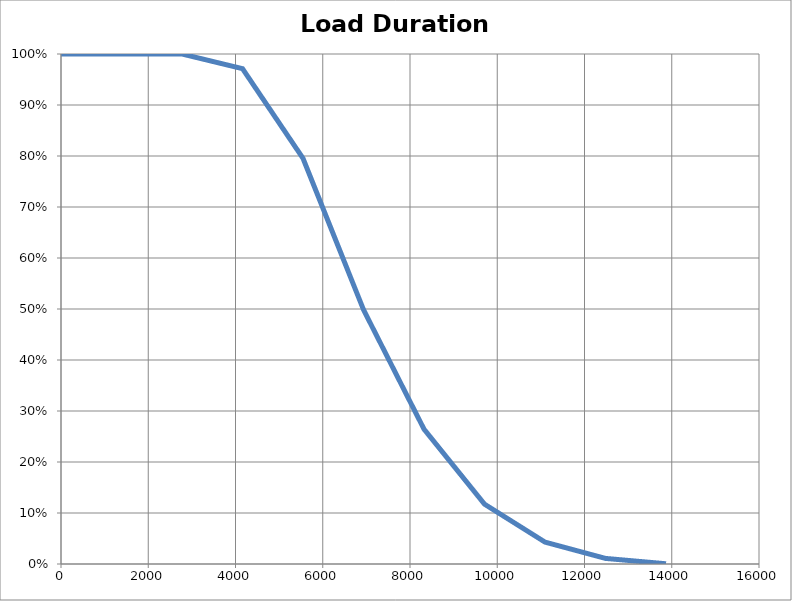
| Category | LDC |
|---|---|
| 0.0 | 1 |
| 13.86830189918268 | 1 |
| 27.73660379836537 | 1 |
| 41.60490569754806 | 1 |
| 55.47320759673074 | 1 |
| 69.3415094959134 | 1 |
| 83.20981139509611 | 1 |
| 97.0781132942788 | 1 |
| 110.9464151934615 | 1 |
| 124.8147170926442 | 1 |
| 138.6830189918269 | 1 |
| 152.5513208910095 | 1 |
| 166.4196227901922 | 1 |
| 180.287924689375 | 1 |
| 194.1562265885576 | 1 |
| 208.0245284877403 | 1 |
| 221.892830386923 | 1 |
| 235.7611322861057 | 1 |
| 249.6294341852883 | 1 |
| 263.497736084471 | 1 |
| 277.3660379836537 | 1 |
| 291.2343398828364 | 1 |
| 305.102641782019 | 1 |
| 318.9709436812017 | 1 |
| 332.8392455803844 | 1 |
| 346.7075474795672 | 1 |
| 360.5758493787498 | 1 |
| 374.4441512779325 | 1 |
| 388.3124531771152 | 1 |
| 402.1807550762979 | 1 |
| 416.0490569754805 | 1 |
| 429.9173588746633 | 1 |
| 443.785660773846 | 1 |
| 457.6539626730286 | 1 |
| 471.5222645722113 | 1 |
| 485.390566471394 | 1 |
| 499.2588683705766 | 1 |
| 513.1271702697592 | 1 |
| 526.995472168942 | 1 |
| 540.8637740681247 | 1 |
| 554.7320759673074 | 1 |
| 568.60037786649 | 1 |
| 582.4686797656728 | 1 |
| 596.3369816648554 | 1 |
| 610.205283564038 | 1 |
| 624.0735854632208 | 1 |
| 637.9418873624035 | 1 |
| 651.8101892615861 | 1 |
| 665.6784911607688 | 1 |
| 679.5467930599516 | 1 |
| 693.4150949591343 | 1 |
| 707.283396858317 | 1 |
| 721.1516987574996 | 1 |
| 735.0200006566823 | 1 |
| 748.888302555865 | 1 |
| 762.7566044550476 | 1 |
| 776.6249063542303 | 1 |
| 790.4932082534131 | 1 |
| 804.3615101525958 | 1 |
| 818.2298120517783 | 1 |
| 832.098113950961 | 1 |
| 845.9664158501438 | 1 |
| 859.8347177493265 | 1 |
| 873.703019648509 | 1 |
| 887.5713215476918 | 1 |
| 901.4396234468745 | 1 |
| 915.3079253460572 | 1 |
| 929.1762272452399 | 1 |
| 943.0445291444227 | 1 |
| 956.9128310436053 | 1 |
| 970.781132942788 | 1 |
| 984.6494348419706 | 1 |
| 998.5177367411532 | 1 |
| 1012.386038640336 | 1 |
| 1026.254340539519 | 1 |
| 1040.122642438701 | 1 |
| 1053.990944337884 | 1 |
| 1067.859246237067 | 1 |
| 1081.727548136249 | 1 |
| 1095.595850035432 | 1 |
| 1109.464151934615 | 1 |
| 1123.332453833797 | 1 |
| 1137.20075573298 | 1 |
| 1151.069057632163 | 1 |
| 1164.937359531346 | 1 |
| 1178.805661430528 | 1 |
| 1192.673963329711 | 1 |
| 1206.542265228893 | 1 |
| 1220.410567128076 | 1 |
| 1234.278869027259 | 1 |
| 1248.147170926442 | 1 |
| 1262.015472825624 | 1 |
| 1275.883774724807 | 1 |
| 1289.75207662399 | 1 |
| 1303.620378523172 | 1 |
| 1317.488680422355 | 1 |
| 1331.356982321538 | 1 |
| 1345.22528422072 | 1 |
| 1359.093586119903 | 1 |
| 1372.961888019086 | 1 |
| 1386.830189918269 | 1 |
| 1400.698491817451 | 1 |
| 1414.566793716634 | 1 |
| 1428.435095615816 | 1 |
| 1442.303397514999 | 1 |
| 1456.171699414182 | 1 |
| 1470.040001313365 | 1 |
| 1483.908303212547 | 1 |
| 1497.77660511173 | 1 |
| 1511.644907010913 | 1 |
| 1525.513208910095 | 1 |
| 1539.381510809278 | 1 |
| 1553.249812708461 | 1 |
| 1567.118114607644 | 1 |
| 1580.986416506826 | 1 |
| 1594.854718406009 | 1 |
| 1608.723020305192 | 1 |
| 1622.591322204374 | 1 |
| 1636.459624103557 | 1 |
| 1650.327926002739 | 1 |
| 1664.196227901922 | 1 |
| 1678.064529801105 | 1 |
| 1691.932831700288 | 1 |
| 1705.80113359947 | 1 |
| 1719.669435498653 | 1 |
| 1733.537737397836 | 1 |
| 1747.406039297018 | 1 |
| 1761.274341196201 | 1 |
| 1775.142643095384 | 1 |
| 1789.010944994566 | 1 |
| 1802.879246893749 | 1 |
| 1816.747548792932 | 1 |
| 1830.615850692114 | 1 |
| 1844.484152591297 | 1 |
| 1858.35245449048 | 1 |
| 1872.220756389662 | 1 |
| 1886.089058288845 | 1 |
| 1899.957360188028 | 1 |
| 1913.825662087211 | 1 |
| 1927.693963986393 | 1 |
| 1941.562265885576 | 1 |
| 1955.430567784758 | 1 |
| 1969.298869683941 | 1 |
| 1983.167171583124 | 1 |
| 1997.035473482307 | 1 |
| 2010.90377538149 | 1 |
| 2024.772077280672 | 1 |
| 2038.640379179855 | 1 |
| 2052.508681079037 | 1 |
| 2066.37698297822 | 1 |
| 2080.245284877403 | 1 |
| 2094.113586776585 | 1 |
| 2107.981888675768 | 1 |
| 2121.85019057495 | 1 |
| 2135.718492474134 | 1 |
| 2149.586794373316 | 1 |
| 2163.455096272498 | 1 |
| 2177.323398171682 | 1 |
| 2191.191700070864 | 1 |
| 2205.060001970047 | 1 |
| 2218.92830386923 | 1 |
| 2232.796605768413 | 1 |
| 2246.664907667595 | 1 |
| 2260.533209566778 | 1 |
| 2274.401511465961 | 1 |
| 2288.269813365143 | 1 |
| 2302.138115264326 | 1 |
| 2316.006417163509 | 1 |
| 2329.874719062691 | 1 |
| 2343.743020961874 | 1 |
| 2357.611322861056 | 1 |
| 2371.479624760239 | 1 |
| 2385.347926659422 | 1 |
| 2399.216228558604 | 1 |
| 2413.084530457787 | 1 |
| 2426.95283235697 | 1 |
| 2440.821134256152 | 1 |
| 2454.689436155335 | 1 |
| 2468.557738054518 | 1 |
| 2482.426039953701 | 1 |
| 2496.294341852883 | 1 |
| 2510.162643752066 | 1 |
| 2524.030945651249 | 1 |
| 2537.899247550431 | 1 |
| 2551.767549449614 | 1 |
| 2565.635851348797 | 1 |
| 2579.50415324798 | 1 |
| 2593.372455147162 | 1 |
| 2607.240757046345 | 1 |
| 2621.109058945528 | 1 |
| 2634.97736084471 | 1 |
| 2648.845662743893 | 1 |
| 2662.713964643076 | 1 |
| 2676.582266542258 | 1 |
| 2690.450568441441 | 1 |
| 2704.318870340624 | 1 |
| 2718.187172239806 | 1 |
| 2732.05547413899 | 1 |
| 2745.923776038171 | 1 |
| 2759.792077937354 | 1 |
| 2773.660379836537 | 1 |
| 2787.52868173572 | 1 |
| 2801.396983634902 | 0.999 |
| 2815.265285534085 | 0.999 |
| 2829.133587433268 | 0.999 |
| 2843.00188933245 | 0.999 |
| 2856.870191231633 | 0.998 |
| 2870.738493130816 | 0.998 |
| 2884.606795029998 | 0.998 |
| 2898.475096929181 | 0.997 |
| 2912.343398828363 | 0.997 |
| 2926.211700727546 | 0.997 |
| 2940.080002626729 | 0.997 |
| 2953.948304525912 | 0.996 |
| 2967.816606425095 | 0.996 |
| 2981.684908324277 | 0.996 |
| 2995.55321022346 | 0.995 |
| 3009.421512122643 | 0.995 |
| 3023.289814021825 | 0.995 |
| 3037.158115921008 | 0.995 |
| 3051.026417820191 | 0.994 |
| 3064.894719719373 | 0.994 |
| 3078.763021618556 | 0.994 |
| 3092.631323517738 | 0.993 |
| 3106.499625416921 | 0.993 |
| 3120.367927316104 | 0.993 |
| 3134.236229215287 | 0.993 |
| 3148.104531114469 | 0.992 |
| 3161.972833013652 | 0.992 |
| 3175.841134912835 | 0.992 |
| 3189.709436812017 | 0.991 |
| 3203.5777387112 | 0.991 |
| 3217.446040610383 | 0.991 |
| 3231.314342509565 | 0.991 |
| 3245.182644408748 | 0.99 |
| 3259.050946307931 | 0.99 |
| 3272.919248207113 | 0.99 |
| 3286.787550106296 | 0.989 |
| 3300.655852005478 | 0.989 |
| 3314.524153904661 | 0.989 |
| 3328.392455803844 | 0.988 |
| 3342.260757703027 | 0.988 |
| 3356.12905960221 | 0.988 |
| 3369.997361501392 | 0.988 |
| 3383.865663400575 | 0.987 |
| 3397.733965299758 | 0.987 |
| 3411.60226719894 | 0.987 |
| 3425.470569098123 | 0.986 |
| 3439.338870997306 | 0.986 |
| 3453.207172896488 | 0.986 |
| 3467.075474795671 | 0.986 |
| 3480.943776694854 | 0.985 |
| 3494.812078594036 | 0.985 |
| 3508.680380493219 | 0.985 |
| 3522.548682392402 | 0.984 |
| 3536.416984291585 | 0.984 |
| 3550.285286190767 | 0.984 |
| 3564.15358808995 | 0.984 |
| 3578.021889989133 | 0.983 |
| 3591.890191888315 | 0.983 |
| 3605.758493787498 | 0.983 |
| 3619.626795686681 | 0.982 |
| 3633.495097585863 | 0.982 |
| 3647.363399485046 | 0.982 |
| 3661.231701384229 | 0.982 |
| 3675.100003283412 | 0.981 |
| 3688.968305182595 | 0.981 |
| 3702.836607081777 | 0.981 |
| 3716.70490898096 | 0.98 |
| 3730.573210880142 | 0.98 |
| 3744.441512779324 | 0.98 |
| 3758.309814678508 | 0.98 |
| 3772.17811657769 | 0.979 |
| 3786.046418476873 | 0.979 |
| 3799.914720376056 | 0.979 |
| 3813.783022275238 | 0.978 |
| 3827.651324174421 | 0.978 |
| 3841.519626073604 | 0.978 |
| 3855.387927972787 | 0.978 |
| 3869.256229871969 | 0.977 |
| 3883.124531771152 | 0.977 |
| 3896.992833670334 | 0.977 |
| 3910.861135569516 | 0.976 |
| 3924.729437468699 | 0.976 |
| 3938.597739367882 | 0.976 |
| 3952.466041267065 | 0.976 |
| 3966.334343166247 | 0.975 |
| 3980.20264506543 | 0.975 |
| 3994.070946964613 | 0.975 |
| 4007.939248863795 | 0.974 |
| 4021.807550762978 | 0.974 |
| 4035.675852662161 | 0.974 |
| 4049.544154561344 | 0.974 |
| 4063.412456460526 | 0.973 |
| 4077.280758359709 | 0.973 |
| 4091.149060258892 | 0.973 |
| 4105.017362158074 | 0.972 |
| 4118.885664057257 | 0.972 |
| 4132.75396595644 | 0.972 |
| 4146.62226785562 | 0.972 |
| 4160.490569754805 | 0.971 |
| 4174.358871653987 | 0.969 |
| 4188.22717355317 | 0.968 |
| 4202.095475452353 | 0.966 |
| 4215.963777351536 | 0.964 |
| 4229.832079250718 | 0.962 |
| 4243.700381149902 | 0.961 |
| 4257.568683049084 | 0.959 |
| 4271.436984948267 | 0.957 |
| 4285.30528684745 | 0.955 |
| 4299.173588746632 | 0.954 |
| 4313.041890645815 | 0.952 |
| 4326.910192544998 | 0.95 |
| 4340.77849444418 | 0.948 |
| 4354.646796343363 | 0.947 |
| 4368.515098242546 | 0.945 |
| 4382.383400141728 | 0.943 |
| 4396.251702040911 | 0.941 |
| 4410.120003940094 | 0.94 |
| 4423.988305839276 | 0.938 |
| 4437.85660773846 | 0.936 |
| 4451.724909637641 | 0.934 |
| 4465.593211536825 | 0.933 |
| 4479.461513436007 | 0.931 |
| 4493.32981533519 | 0.929 |
| 4507.198117234373 | 0.927 |
| 4521.066419133555 | 0.926 |
| 4534.934721032738 | 0.924 |
| 4548.803022931921 | 0.922 |
| 4562.671324831103 | 0.92 |
| 4576.539626730286 | 0.918 |
| 4590.40792862947 | 0.917 |
| 4604.276230528651 | 0.915 |
| 4618.144532427833 | 0.913 |
| 4632.012834327017 | 0.911 |
| 4645.8811362262 | 0.91 |
| 4659.749438125383 | 0.908 |
| 4673.617740024565 | 0.906 |
| 4687.486041923747 | 0.904 |
| 4701.354343822931 | 0.903 |
| 4715.222645722113 | 0.901 |
| 4729.090947621296 | 0.899 |
| 4742.959249520478 | 0.897 |
| 4756.82755141966 | 0.896 |
| 4770.695853318844 | 0.894 |
| 4784.564155218026 | 0.892 |
| 4798.432457117208 | 0.89 |
| 4812.300759016392 | 0.889 |
| 4826.169060915573 | 0.887 |
| 4840.037362814756 | 0.885 |
| 4853.90566471394 | 0.883 |
| 4867.773966613122 | 0.882 |
| 4881.642268512304 | 0.88 |
| 4895.510570411487 | 0.878 |
| 4909.37887231067 | 0.876 |
| 4923.247174209853 | 0.875 |
| 4937.115476109035 | 0.873 |
| 4950.983778008218 | 0.871 |
| 4964.8520799074 | 0.869 |
| 4978.720381806584 | 0.868 |
| 4992.588683705766 | 0.866 |
| 5006.45698560495 | 0.864 |
| 5020.325287504131 | 0.862 |
| 5034.193589403314 | 0.86 |
| 5048.061891302497 | 0.859 |
| 5061.93019320168 | 0.857 |
| 5075.798495100863 | 0.855 |
| 5089.666797000045 | 0.853 |
| 5103.535098899228 | 0.852 |
| 5117.403400798411 | 0.85 |
| 5131.271702697593 | 0.848 |
| 5145.140004596775 | 0.846 |
| 5159.00830649596 | 0.845 |
| 5172.876608395141 | 0.843 |
| 5186.744910294324 | 0.841 |
| 5200.613212193507 | 0.839 |
| 5214.48151409269 | 0.838 |
| 5228.349815991872 | 0.836 |
| 5242.218117891055 | 0.834 |
| 5256.086419790237 | 0.832 |
| 5269.95472168942 | 0.831 |
| 5283.823023588603 | 0.829 |
| 5297.691325487785 | 0.827 |
| 5311.559627386968 | 0.825 |
| 5325.427929286151 | 0.824 |
| 5339.296231185333 | 0.822 |
| 5353.164533084516 | 0.82 |
| 5367.0328349837 | 0.818 |
| 5380.901136882881 | 0.817 |
| 5394.769438782065 | 0.815 |
| 5408.637740681247 | 0.813 |
| 5422.50604258043 | 0.811 |
| 5436.374344479612 | 0.809 |
| 5450.242646378795 | 0.808 |
| 5464.110948277978 | 0.806 |
| 5477.979250177161 | 0.804 |
| 5491.847552076343 | 0.802 |
| 5505.715853975526 | 0.801 |
| 5519.584155874709 | 0.799 |
| 5533.452457773891 | 0.797 |
| 5547.320759673074 | 0.795 |
| 5561.189061572256 | 0.792 |
| 5575.05736347144 | 0.789 |
| 5588.925665370622 | 0.787 |
| 5602.793967269805 | 0.784 |
| 5616.662269168988 | 0.781 |
| 5630.53057106817 | 0.778 |
| 5644.398872967352 | 0.775 |
| 5658.267174866535 | 0.772 |
| 5672.135476765717 | 0.769 |
| 5686.0037786649 | 0.766 |
| 5699.872080564083 | 0.763 |
| 5713.740382463266 | 0.76 |
| 5727.608684362448 | 0.757 |
| 5741.476986261631 | 0.754 |
| 5755.345288160813 | 0.751 |
| 5769.213590059996 | 0.748 |
| 5783.08189195918 | 0.745 |
| 5796.950193858362 | 0.742 |
| 5810.818495757545 | 0.739 |
| 5824.686797656727 | 0.736 |
| 5838.55509955591 | 0.733 |
| 5852.423401455092 | 0.73 |
| 5866.291703354275 | 0.727 |
| 5880.160005253458 | 0.724 |
| 5894.028307152641 | 0.721 |
| 5907.896609051823 | 0.718 |
| 5921.764910951006 | 0.715 |
| 5935.63321285019 | 0.712 |
| 5949.501514749371 | 0.709 |
| 5963.369816648555 | 0.706 |
| 5977.238118547737 | 0.703 |
| 5991.10642044692 | 0.7 |
| 6004.974722346103 | 0.697 |
| 6018.843024245285 | 0.695 |
| 6032.711326144467 | 0.692 |
| 6046.57962804365 | 0.689 |
| 6060.447929942833 | 0.686 |
| 6074.316231842016 | 0.683 |
| 6088.184533741198 | 0.68 |
| 6102.052835640381 | 0.677 |
| 6115.921137539564 | 0.674 |
| 6129.789439438746 | 0.671 |
| 6143.65774133793 | 0.668 |
| 6157.526043237112 | 0.665 |
| 6171.394345136295 | 0.662 |
| 6185.262647035477 | 0.659 |
| 6199.13094893466 | 0.656 |
| 6212.999250833843 | 0.653 |
| 6226.867552733026 | 0.65 |
| 6240.735854632208 | 0.647 |
| 6254.60415653139 | 0.644 |
| 6268.472458430574 | 0.641 |
| 6282.340760329756 | 0.638 |
| 6296.209062228939 | 0.635 |
| 6310.077364128122 | 0.632 |
| 6323.945666027304 | 0.629 |
| 6337.813967926487 | 0.626 |
| 6351.68226982567 | 0.623 |
| 6365.550571724852 | 0.62 |
| 6379.418873624035 | 0.617 |
| 6393.287175523218 | 0.614 |
| 6407.1554774224 | 0.611 |
| 6421.023779321584 | 0.608 |
| 6434.892081220766 | 0.605 |
| 6448.760383119948 | 0.603 |
| 6462.628685019131 | 0.6 |
| 6476.496986918314 | 0.597 |
| 6490.365288817496 | 0.594 |
| 6504.233590716679 | 0.591 |
| 6518.101892615861 | 0.588 |
| 6531.970194515045 | 0.585 |
| 6545.838496414227 | 0.582 |
| 6559.706798313409 | 0.579 |
| 6573.575100212593 | 0.576 |
| 6587.443402111775 | 0.573 |
| 6601.311704010957 | 0.57 |
| 6615.180005910141 | 0.567 |
| 6629.048307809323 | 0.564 |
| 6642.916609708505 | 0.561 |
| 6656.784911607688 | 0.558 |
| 6670.65321350687 | 0.555 |
| 6684.521515406054 | 0.552 |
| 6698.389817305237 | 0.549 |
| 6712.25811920442 | 0.546 |
| 6726.1264211036 | 0.543 |
| 6739.994723002785 | 0.54 |
| 6753.863024901967 | 0.537 |
| 6767.73132680115 | 0.534 |
| 6781.599628700332 | 0.531 |
| 6795.467930599515 | 0.528 |
| 6809.336232498698 | 0.525 |
| 6823.20453439788 | 0.522 |
| 6837.072836297063 | 0.519 |
| 6850.941138196246 | 0.516 |
| 6864.809440095428 | 0.513 |
| 6878.677741994612 | 0.511 |
| 6892.546043893794 | 0.508 |
| 6906.414345792977 | 0.505 |
| 6920.28264769216 | 0.502 |
| 6934.150949591342 | 0.499 |
| 6948.019251490524 | 0.496 |
| 6961.887553389708 | 0.494 |
| 6975.75585528889 | 0.492 |
| 6989.624157188073 | 0.489 |
| 7003.492459087256 | 0.487 |
| 7017.360760986438 | 0.485 |
| 7031.229062885621 | 0.482 |
| 7045.097364784804 | 0.48 |
| 7058.965666683986 | 0.478 |
| 7072.83396858317 | 0.475 |
| 7086.702270482352 | 0.473 |
| 7100.570572381534 | 0.471 |
| 7114.438874280718 | 0.468 |
| 7128.3071761799 | 0.466 |
| 7142.175478079082 | 0.463 |
| 7156.043779978266 | 0.461 |
| 7169.912081877448 | 0.459 |
| 7183.780383776631 | 0.456 |
| 7197.648685675813 | 0.454 |
| 7211.516987574996 | 0.452 |
| 7225.38528947418 | 0.449 |
| 7239.253591373362 | 0.447 |
| 7253.121893272544 | 0.445 |
| 7266.990195171727 | 0.442 |
| 7280.85849707091 | 0.44 |
| 7294.726798970092 | 0.438 |
| 7308.595100869275 | 0.435 |
| 7322.463402768458 | 0.433 |
| 7336.33170466764 | 0.431 |
| 7350.200006566823 | 0.428 |
| 7364.068308466006 | 0.426 |
| 7377.93661036519 | 0.424 |
| 7391.804912264372 | 0.421 |
| 7405.673214163553 | 0.419 |
| 7419.541516062737 | 0.417 |
| 7433.40981796192 | 0.414 |
| 7447.278119861102 | 0.412 |
| 7461.146421760285 | 0.41 |
| 7475.014723659467 | 0.407 |
| 7488.88302555865 | 0.405 |
| 7502.751327457833 | 0.403 |
| 7516.619629357015 | 0.4 |
| 7530.487931256198 | 0.398 |
| 7544.35623315538 | 0.396 |
| 7558.224535054563 | 0.393 |
| 7572.092836953746 | 0.391 |
| 7585.96113885293 | 0.389 |
| 7599.829440752111 | 0.386 |
| 7613.697742651295 | 0.384 |
| 7627.566044550477 | 0.382 |
| 7641.43434644966 | 0.379 |
| 7655.302648348843 | 0.377 |
| 7669.170950248025 | 0.374 |
| 7683.039252147208 | 0.372 |
| 7696.907554046391 | 0.37 |
| 7710.775855945573 | 0.367 |
| 7724.644157844756 | 0.365 |
| 7738.512459743938 | 0.363 |
| 7752.380761643121 | 0.36 |
| 7766.249063542305 | 0.358 |
| 7780.117365441486 | 0.356 |
| 7793.985667340669 | 0.353 |
| 7807.85396923985 | 0.351 |
| 7821.722271139033 | 0.349 |
| 7835.590573038216 | 0.346 |
| 7849.458874937399 | 0.344 |
| 7863.327176836581 | 0.342 |
| 7877.195478735764 | 0.339 |
| 7891.063780634947 | 0.337 |
| 7904.932082534129 | 0.335 |
| 7918.800384433312 | 0.332 |
| 7932.668686332495 | 0.33 |
| 7946.536988231678 | 0.328 |
| 7960.405290130861 | 0.325 |
| 7974.273592030043 | 0.323 |
| 7988.141893929226 | 0.321 |
| 8002.010195828409 | 0.318 |
| 8015.878497727591 | 0.316 |
| 8029.746799626774 | 0.314 |
| 8043.615101525956 | 0.311 |
| 8057.483403425139 | 0.309 |
| 8071.351705324322 | 0.307 |
| 8085.220007223505 | 0.304 |
| 8099.088309122688 | 0.302 |
| 8112.95661102187 | 0.3 |
| 8126.824912921053 | 0.297 |
| 8140.693214820236 | 0.295 |
| 8154.561516719418 | 0.292 |
| 8168.429818618601 | 0.29 |
| 8182.298120517783 | 0.288 |
| 8196.166422416967 | 0.285 |
| 8210.034724316149 | 0.283 |
| 8223.90302621533 | 0.281 |
| 8237.771328114515 | 0.278 |
| 8251.639630013697 | 0.276 |
| 8265.50793191288 | 0.274 |
| 8279.376233812063 | 0.271 |
| 8293.244535711245 | 0.269 |
| 8307.112837610426 | 0.267 |
| 8320.981139509611 | 0.264 |
| 8334.849441408793 | 0.263 |
| 8348.717743307974 | 0.261 |
| 8362.58604520716 | 0.26 |
| 8376.45434710634 | 0.259 |
| 8390.322649005522 | 0.257 |
| 8404.190950904707 | 0.256 |
| 8418.059252803889 | 0.254 |
| 8431.927554703072 | 0.253 |
| 8445.795856602255 | 0.251 |
| 8459.664158501437 | 0.25 |
| 8473.53246040062 | 0.248 |
| 8487.400762299803 | 0.247 |
| 8501.269064198985 | 0.245 |
| 8515.137366098168 | 0.244 |
| 8529.005667997351 | 0.242 |
| 8542.873969896535 | 0.241 |
| 8556.742271795716 | 0.239 |
| 8570.6105736949 | 0.238 |
| 8584.478875594083 | 0.236 |
| 8598.347177493264 | 0.235 |
| 8612.215479392447 | 0.234 |
| 8626.08378129163 | 0.232 |
| 8639.952083190812 | 0.231 |
| 8653.820385089995 | 0.229 |
| 8667.688686989179 | 0.228 |
| 8681.55698888836 | 0.226 |
| 8695.425290787543 | 0.225 |
| 8709.293592686727 | 0.223 |
| 8723.161894585908 | 0.222 |
| 8737.030196485091 | 0.22 |
| 8750.898498384275 | 0.219 |
| 8764.766800283456 | 0.217 |
| 8778.63510218264 | 0.216 |
| 8792.503404081823 | 0.214 |
| 8806.371705981004 | 0.213 |
| 8820.240007880187 | 0.211 |
| 8834.10830977937 | 0.21 |
| 8847.976611678552 | 0.209 |
| 8861.844913577735 | 0.207 |
| 8875.713215476919 | 0.206 |
| 8889.5815173761 | 0.204 |
| 8903.449819275284 | 0.203 |
| 8917.318121174467 | 0.201 |
| 8931.18642307365 | 0.2 |
| 8945.054724972832 | 0.198 |
| 8958.923026872015 | 0.197 |
| 8972.791328771198 | 0.195 |
| 8986.65963067038 | 0.194 |
| 9000.527932569563 | 0.192 |
| 9014.396234468746 | 0.191 |
| 9028.264536367928 | 0.189 |
| 9042.13283826711 | 0.188 |
| 9056.001140166294 | 0.186 |
| 9069.869442065476 | 0.185 |
| 9083.737743964659 | 0.184 |
| 9097.606045863842 | 0.182 |
| 9111.474347763024 | 0.181 |
| 9125.342649662207 | 0.179 |
| 9139.21095156139 | 0.178 |
| 9153.079253460572 | 0.176 |
| 9166.947555359753 | 0.175 |
| 9180.815857258938 | 0.173 |
| 9194.68415915812 | 0.172 |
| 9208.552461057301 | 0.17 |
| 9222.420762956486 | 0.169 |
| 9236.289064855668 | 0.167 |
| 9250.157366754851 | 0.166 |
| 9264.025668654034 | 0.164 |
| 9277.893970553218 | 0.163 |
| 9291.762272452397 | 0.161 |
| 9305.63057435158 | 0.16 |
| 9319.498876250766 | 0.159 |
| 9333.367178149947 | 0.157 |
| 9347.23548004913 | 0.156 |
| 9361.103781948314 | 0.154 |
| 9374.972083847495 | 0.153 |
| 9388.840385746678 | 0.151 |
| 9402.708687645862 | 0.15 |
| 9416.576989545043 | 0.148 |
| 9430.445291444226 | 0.147 |
| 9444.31359334341 | 0.145 |
| 9458.181895242591 | 0.144 |
| 9472.050197141774 | 0.142 |
| 9485.918499040958 | 0.141 |
| 9499.786800940139 | 0.139 |
| 9513.655102839322 | 0.138 |
| 9527.523404738506 | 0.136 |
| 9541.391706637687 | 0.135 |
| 9555.260008536869 | 0.134 |
| 9569.128310436052 | 0.132 |
| 9582.996612335235 | 0.131 |
| 9596.864914234417 | 0.129 |
| 9610.7332161336 | 0.128 |
| 9624.60151803278 | 0.126 |
| 9638.469819931965 | 0.125 |
| 9652.338121831148 | 0.123 |
| 9666.206423730331 | 0.122 |
| 9680.074725629513 | 0.12 |
| 9693.943027528696 | 0.119 |
| 9707.81132942788 | 0.117 |
| 9721.67963132706 | 0.117 |
| 9735.547933226244 | 0.116 |
| 9749.416235125427 | 0.115 |
| 9763.284537024609 | 0.114 |
| 9777.152838923792 | 0.114 |
| 9791.021140822975 | 0.113 |
| 9804.889442722158 | 0.112 |
| 9818.75774462134 | 0.111 |
| 9832.626046520523 | 0.111 |
| 9846.494348419707 | 0.11 |
| 9860.362650318886 | 0.109 |
| 9874.23095221807 | 0.108 |
| 9888.099254117255 | 0.108 |
| 9901.967556016434 | 0.107 |
| 9915.83585791562 | 0.106 |
| 9929.7041598148 | 0.105 |
| 9943.572461713984 | 0.105 |
| 9957.440763613167 | 0.104 |
| 9971.30906551235 | 0.103 |
| 9985.177367411532 | 0.102 |
| 9999.045669310715 | 0.102 |
| 10012.9139712099 | 0.101 |
| 10026.78227310908 | 0.1 |
| 10040.65057500826 | 0.099 |
| 10054.51887690745 | 0.099 |
| 10068.38717880663 | 0.098 |
| 10082.25548070581 | 0.097 |
| 10096.12378260499 | 0.097 |
| 10109.99208450418 | 0.096 |
| 10123.86038640336 | 0.095 |
| 10137.72868830254 | 0.094 |
| 10151.59699020173 | 0.094 |
| 10165.46529210091 | 0.093 |
| 10179.33359400009 | 0.092 |
| 10193.20189589927 | 0.091 |
| 10207.07019779846 | 0.091 |
| 10220.93849969764 | 0.09 |
| 10234.80680159682 | 0.089 |
| 10248.675103496 | 0.088 |
| 10262.54340539519 | 0.088 |
| 10276.41170729437 | 0.087 |
| 10290.28000919355 | 0.086 |
| 10304.14831109273 | 0.085 |
| 10318.01661299192 | 0.085 |
| 10331.8849148911 | 0.084 |
| 10345.75321679028 | 0.083 |
| 10359.62151868947 | 0.082 |
| 10373.48982058865 | 0.082 |
| 10387.35812248783 | 0.081 |
| 10401.22642438701 | 0.08 |
| 10415.0947262862 | 0.079 |
| 10428.96302818538 | 0.079 |
| 10442.83133008456 | 0.078 |
| 10456.69963198374 | 0.077 |
| 10470.56793388293 | 0.076 |
| 10484.43623578211 | 0.076 |
| 10498.30453768129 | 0.075 |
| 10512.17283958047 | 0.074 |
| 10526.04114147966 | 0.073 |
| 10539.90944337884 | 0.073 |
| 10553.77774527802 | 0.072 |
| 10567.64604717721 | 0.071 |
| 10581.51434907639 | 0.07 |
| 10595.38265097557 | 0.07 |
| 10609.25095287475 | 0.069 |
| 10623.11925477394 | 0.068 |
| 10636.98755667312 | 0.067 |
| 10650.8558585723 | 0.067 |
| 10664.72416047149 | 0.066 |
| 10678.59246237067 | 0.065 |
| 10692.46076426985 | 0.065 |
| 10706.32906616903 | 0.064 |
| 10720.19736806821 | 0.063 |
| 10734.0656699674 | 0.062 |
| 10747.93397186658 | 0.062 |
| 10761.80227376576 | 0.061 |
| 10775.67057566495 | 0.06 |
| 10789.53887756413 | 0.059 |
| 10803.40717946331 | 0.059 |
| 10817.27548136249 | 0.058 |
| 10831.14378326168 | 0.057 |
| 10845.01208516086 | 0.056 |
| 10858.88038706004 | 0.056 |
| 10872.74868895923 | 0.055 |
| 10886.61699085841 | 0.054 |
| 10900.48529275759 | 0.053 |
| 10914.35359465677 | 0.053 |
| 10928.22189655596 | 0.052 |
| 10942.09019845514 | 0.051 |
| 10955.95850035432 | 0.05 |
| 10969.8268022535 | 0.05 |
| 10983.69510415269 | 0.049 |
| 10997.56340605187 | 0.048 |
| 11011.43170795105 | 0.047 |
| 11025.30000985023 | 0.047 |
| 11039.16831174942 | 0.046 |
| 11053.0366136486 | 0.045 |
| 11066.90491554778 | 0.044 |
| 11080.77321744697 | 0.044 |
| 11094.64151934615 | 0.043 |
| 11108.50982124533 | 0.043 |
| 11122.37812314451 | 0.042 |
| 11136.2464250437 | 0.042 |
| 11150.11472694288 | 0.042 |
| 11163.98302884206 | 0.041 |
| 11177.85133074124 | 0.041 |
| 11191.71963264043 | 0.041 |
| 11205.58793453961 | 0.04 |
| 11219.45623643879 | 0.04 |
| 11233.32453833798 | 0.04 |
| 11247.19284023716 | 0.039 |
| 11261.06114213634 | 0.039 |
| 11274.92944403552 | 0.039 |
| 11288.7977459347 | 0.038 |
| 11302.66604783389 | 0.038 |
| 11316.53434973307 | 0.038 |
| 11330.40265163225 | 0.037 |
| 11344.27095353144 | 0.037 |
| 11358.13925543062 | 0.037 |
| 11372.0075573298 | 0.037 |
| 11385.87585922898 | 0.036 |
| 11399.74416112817 | 0.036 |
| 11413.61246302735 | 0.036 |
| 11427.48076492653 | 0.035 |
| 11441.34906682571 | 0.035 |
| 11455.2173687249 | 0.035 |
| 11469.08567062408 | 0.034 |
| 11482.95397252326 | 0.034 |
| 11496.82227442245 | 0.034 |
| 11510.69057632163 | 0.033 |
| 11524.55887822081 | 0.033 |
| 11538.42718011999 | 0.033 |
| 11552.29548201918 | 0.032 |
| 11566.16378391836 | 0.032 |
| 11580.03208581754 | 0.032 |
| 11593.90038771672 | 0.031 |
| 11607.76868961591 | 0.031 |
| 11621.63699151509 | 0.031 |
| 11635.50529341427 | 0.03 |
| 11649.37359531345 | 0.03 |
| 11663.24189721264 | 0.03 |
| 11677.11019911182 | 0.029 |
| 11690.978501011 | 0.029 |
| 11704.84680291019 | 0.029 |
| 11718.71510480937 | 0.029 |
| 11732.58340670855 | 0.028 |
| 11746.45170860773 | 0.028 |
| 11760.32001050692 | 0.028 |
| 11774.1883124061 | 0.027 |
| 11788.05661430528 | 0.027 |
| 11801.92491620447 | 0.027 |
| 11815.79321810365 | 0.026 |
| 11829.66152000283 | 0.026 |
| 11843.52982190201 | 0.026 |
| 11857.39812380119 | 0.025 |
| 11871.26642570038 | 0.025 |
| 11885.13472759956 | 0.025 |
| 11899.00302949874 | 0.024 |
| 11912.87133139793 | 0.024 |
| 11926.73963329711 | 0.024 |
| 11940.60793519629 | 0.023 |
| 11954.47623709547 | 0.023 |
| 11968.34453899466 | 0.023 |
| 11982.21284089384 | 0.022 |
| 11996.08114279302 | 0.022 |
| 12009.94944469221 | 0.022 |
| 12023.81774659139 | 0.022 |
| 12037.68604849057 | 0.021 |
| 12051.55435038975 | 0.021 |
| 12065.42265228893 | 0.021 |
| 12079.29095418812 | 0.02 |
| 12093.1592560873 | 0.02 |
| 12107.02755798648 | 0.02 |
| 12120.89585988567 | 0.019 |
| 12134.76416178485 | 0.019 |
| 12148.63246368403 | 0.019 |
| 12162.50076558321 | 0.018 |
| 12176.3690674824 | 0.018 |
| 12190.23736938158 | 0.018 |
| 12204.10567128076 | 0.017 |
| 12217.97397317995 | 0.017 |
| 12231.84227507913 | 0.017 |
| 12245.71057697831 | 0.016 |
| 12259.57887887749 | 0.016 |
| 12273.44718077668 | 0.016 |
| 12287.31548267586 | 0.015 |
| 12301.18378457504 | 0.015 |
| 12315.05208647422 | 0.015 |
| 12328.92038837341 | 0.014 |
| 12342.78869027259 | 0.014 |
| 12356.65699217177 | 0.014 |
| 12370.52529407095 | 0.014 |
| 12384.39359597014 | 0.013 |
| 12398.26189786932 | 0.013 |
| 12412.1301997685 | 0.013 |
| 12425.99850166769 | 0.012 |
| 12439.86680356687 | 0.012 |
| 12453.73510546605 | 0.012 |
| 12467.60340736523 | 0.011 |
| 12481.47170926442 | 0.011 |
| 12495.3400111636 | 0.011 |
| 12509.20831306278 | 0.011 |
| 12523.07661496196 | 0.011 |
| 12536.94491686115 | 0.011 |
| 12550.81321876033 | 0.01 |
| 12564.68152065951 | 0.01 |
| 12578.5498225587 | 0.01 |
| 12592.41812445788 | 0.01 |
| 12606.28642635706 | 0.01 |
| 12620.15472825624 | 0.01 |
| 12634.02303015543 | 0.01 |
| 12647.89133205461 | 0.01 |
| 12661.75963395379 | 0.01 |
| 12675.62793585297 | 0.009 |
| 12689.49623775216 | 0.009 |
| 12703.36453965134 | 0.009 |
| 12717.23284155052 | 0.009 |
| 12731.1011434497 | 0.009 |
| 12744.96944534889 | 0.009 |
| 12758.83774724807 | 0.009 |
| 12772.70604914725 | 0.009 |
| 12786.57435104644 | 0.009 |
| 12800.44265294562 | 0.009 |
| 12814.3109548448 | 0.008 |
| 12828.17925674398 | 0.008 |
| 12842.04755864317 | 0.008 |
| 12855.91586054235 | 0.008 |
| 12869.78416244153 | 0.008 |
| 12883.65246434072 | 0.008 |
| 12897.5207662399 | 0.008 |
| 12911.38906813908 | 0.008 |
| 12925.25737003826 | 0.008 |
| 12939.12567193745 | 0.007 |
| 12952.99397383663 | 0.007 |
| 12966.86227573581 | 0.007 |
| 12980.73057763499 | 0.007 |
| 12994.59887953418 | 0.007 |
| 13008.46718143336 | 0.007 |
| 13022.33548333254 | 0.007 |
| 13036.20378523172 | 0.007 |
| 13050.07208713091 | 0.007 |
| 13063.94038903009 | 0.007 |
| 13077.80869092927 | 0.006 |
| 13091.67699282845 | 0.006 |
| 13105.54529472764 | 0.006 |
| 13119.41359662682 | 0.006 |
| 13133.281898526 | 0.006 |
| 13147.15020042519 | 0.006 |
| 13161.01850232437 | 0.006 |
| 13174.88680422355 | 0.006 |
| 13188.75510612273 | 0.006 |
| 13202.62340802191 | 0.005 |
| 13216.4917099211 | 0.005 |
| 13230.36001182028 | 0.005 |
| 13244.22831371946 | 0.005 |
| 13258.09661561865 | 0.005 |
| 13271.96491751783 | 0.005 |
| 13285.83321941701 | 0.005 |
| 13299.70152131619 | 0.005 |
| 13313.56982321538 | 0.005 |
| 13327.43812511456 | 0.005 |
| 13341.30642701374 | 0.004 |
| 13355.17472891293 | 0.004 |
| 13369.04303081211 | 0.004 |
| 13382.9113327113 | 0.004 |
| 13396.77963461047 | 0.004 |
| 13410.64793650966 | 0.004 |
| 13424.51623840884 | 0.004 |
| 13438.38454030802 | 0.004 |
| 13452.2528422072 | 0.004 |
| 13466.12114410639 | 0.004 |
| 13479.98944600557 | 0.003 |
| 13493.85774790475 | 0.003 |
| 13507.72604980393 | 0.003 |
| 13521.59435170312 | 0.003 |
| 13535.4626536023 | 0.003 |
| 13549.33095550148 | 0.003 |
| 13563.19925740067 | 0.003 |
| 13577.06755929985 | 0.003 |
| 13590.93586119903 | 0.003 |
| 13604.80416309821 | 0.002 |
| 13618.6724649974 | 0.002 |
| 13632.54076689658 | 0.002 |
| 13646.40906879576 | 0.002 |
| 13660.27737069494 | 0.002 |
| 13674.14567259413 | 0.002 |
| 13688.01397449331 | 0.002 |
| 13701.88227639249 | 0.002 |
| 13715.75057829168 | 0.002 |
| 13729.61888019086 | 0.002 |
| 13743.48718209004 | 0.001 |
| 13757.35548398922 | 0.001 |
| 13771.22378588841 | 0.001 |
| 13785.09208778759 | 0.001 |
| 13798.96038968677 | 0.001 |
| 13812.82869158595 | 0.001 |
| 13826.69699348514 | 0.001 |
| 13840.56529538432 | 0.001 |
| 13854.4335972835 | 0.001 |
| 13868.30189918268 | 0 |